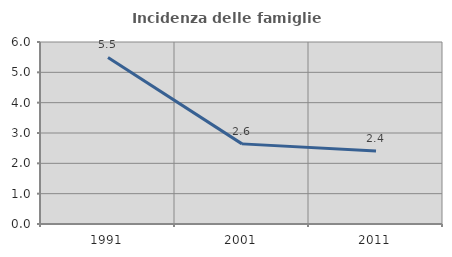
| Category | Incidenza delle famiglie numerose |
|---|---|
| 1991.0 | 5.493 |
| 2001.0 | 2.641 |
| 2011.0 | 2.408 |